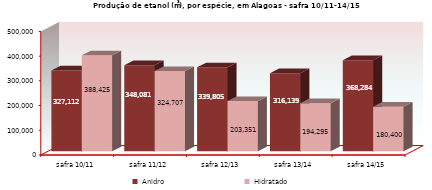
| Category | Anidro | Hidratado |
|---|---|---|
| safra 10/11 | 327112 | 388425 |
| safra 11/12 | 348081 | 324707 |
| safra 12/13 | 339805 | 203351 |
| safra 13/14 | 316139 | 194295 |
| safra 14/15 | 368284 | 180400 |